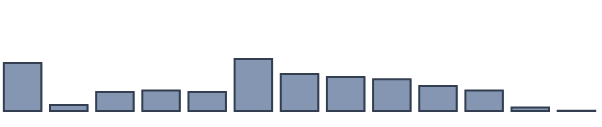
| Category | Series 0 |
|---|---|
| 0 | 15.1 |
| 1 | 1.9 |
| 2 | 6 |
| 3 | 6.5 |
| 4 | 6 |
| 5 | 16.4 |
| 6 | 11.7 |
| 7 | 10.7 |
| 8 | 10 |
| 9 | 7.9 |
| 10 | 6.5 |
| 11 | 1.1 |
| 12 | 0.1 |